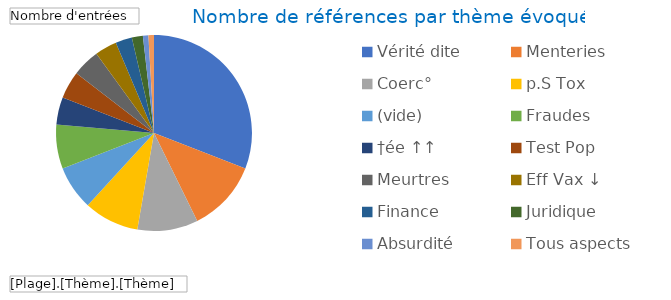
| Category | Total |
|---|---|
| Vérité dite | 34 |
| Menteries | 13 |
| Coerc° | 11 |
| p.S Tox | 10 |
| (vide) | 8 |
| Fraudes | 8 |
| †ée ↑↑ | 5 |
| Test Pop | 5 |
| Meurtres | 5 |
| Eff Vax ↓ | 4 |
| Finance | 3 |
| Juridique | 2 |
| Absurdité | 1 |
| Tous aspects | 1 |